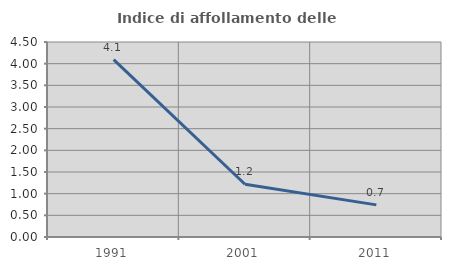
| Category | Indice di affollamento delle abitazioni  |
|---|---|
| 1991.0 | 4.091 |
| 2001.0 | 1.217 |
| 2011.0 | 0.741 |